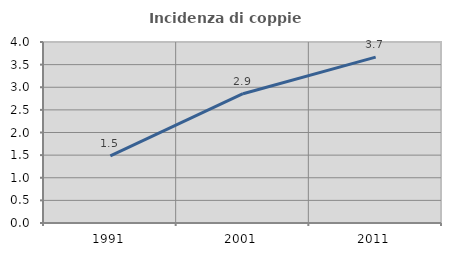
| Category | Incidenza di coppie miste |
|---|---|
| 1991.0 | 1.481 |
| 2001.0 | 2.857 |
| 2011.0 | 3.667 |